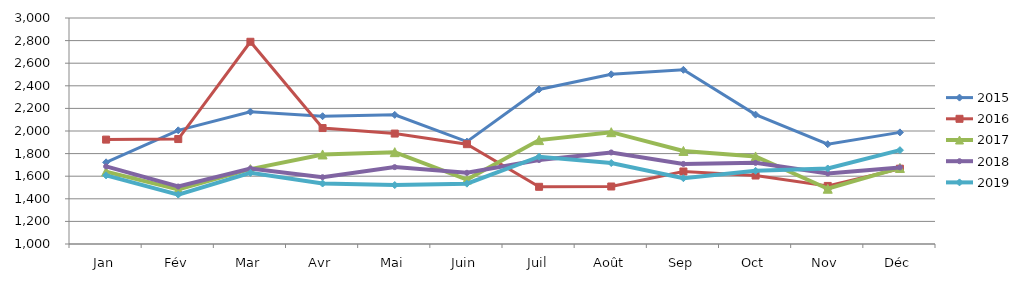
| Category | 2015 | 2016 | 2017 | 2018 | 2019 |
|---|---|---|---|---|---|
| Jan | 1722.709 | 1923.844 | 1640.588 | 1686.867 | 1607.175 |
| Fév | 2005.966 | 1928.725 | 1482.786 | 1508.532 | 1437.165 |
| Mar | 2170.837 | 2789.59 | 1662.652 | 1668.652 | 1629.313 |
| Avr | 2130.693 | 2026.062 | 1792.363 | 1590.954 | 1535.253 |
| Mai | 2142.701 | 1977.297 | 1812.852 | 1680.332 | 1521.753 |
| Juin | 1905.998 | 1883.42 | 1569.867 | 1630.014 | 1533.936 |
| Juil | 2367.564 | 1506.17 | 1919.409 | 1743.106 | 1772.447 |
| Août | 2501.772 | 1508.949 | 1989.564 | 1810.105 | 1716.734 |
| Sep | 2541.368 | 1641.762 | 1823.497 | 1708.545 | 1582.179 |
| Oct | 2144.711 | 1605.922 | 1774.693 | 1718.052 | 1647.591 |
| Nov | 1883.138 | 1513.836 | 1489.145 | 1623.98 | 1668.294 |
| Déc | 1987.813 | 1666.498 | 1673.304 | 1677.915 | 1830.413 |